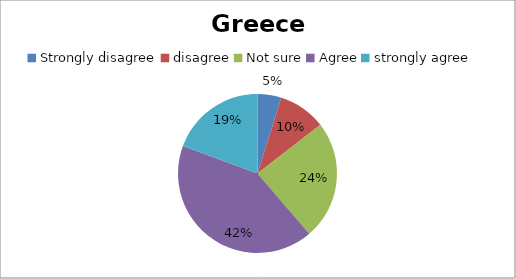
| Category | Series 0 |
|---|---|
| Strongly disagree | 3 |
| disagree | 6 |
| Not sure | 15 |
| Agree | 26 |
| strongly agree | 12 |